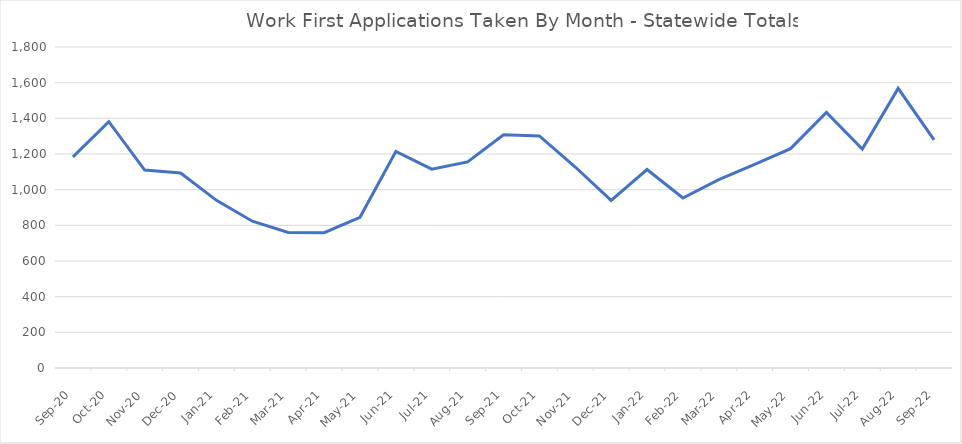
| Category | Series 0 |
|---|---|
| 2022-09-22 | 1279 |
| 2022-08-22 | 1568 |
| 2022-07-22 | 1228 |
| 2022-06-01 | 1433 |
| 2022-05-01 | 1230 |
| 2022-04-01 | 1142 |
| 2022-03-01 | 1056 |
| 2022-02-01 | 953 |
| 2022-01-01 | 1113 |
| 2021-12-02 | 940 |
| 2021-11-01 | 1127 |
| 2021-10-01 | 1301 |
| 2021-09-01 | 1308 |
| 2021-08-01 | 1156 |
| 2021-07-01 | 1115 |
| 2021-06-01 | 1214 |
| 2021-05-01 | 845 |
| 2021-04-01 | 759 |
| 2021-03-01 | 760 |
| 2021-02-01 | 823 |
| 2021-01-01 | 940 |
| 2020-12-01 | 1093 |
| 2020-11-01 | 1110 |
| 2020-10-01 | 1381 |
| 2020-09-01 | 1184 |